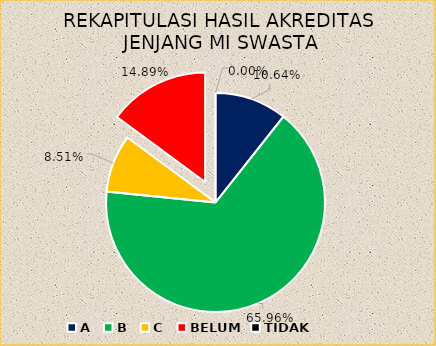
| Category | REKAPITULASI HASIL AKREDITASI JENJANG MI SWASTA |
|---|---|
| A | 5 |
| B | 31 |
| C | 4 |
| BELUM | 7 |
| TIDAK | 0 |